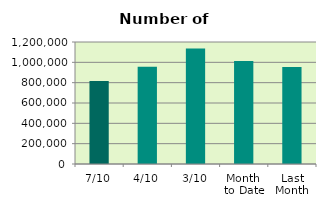
| Category | Series 0 |
|---|---|
| 7/10 | 815196 |
| 4/10 | 955762 |
| 3/10 | 1135128 |
| Month 
to Date | 1014278.4 |
| Last
Month | 952931.048 |